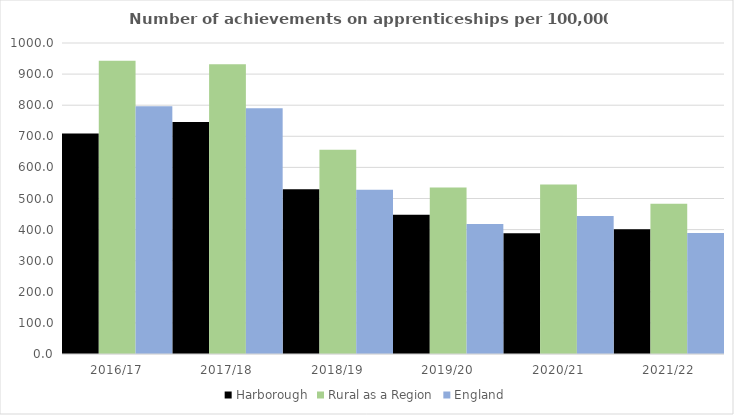
| Category | Harborough | Rural as a Region | England |
|---|---|---|---|
| 2016/17 | 709 | 942.594 | 797 |
| 2017/18 | 746 | 931.709 | 790 |
| 2018/19 | 530 | 656.44 | 528 |
| 2019/20 | 448 | 535.552 | 418 |
| 2020/21 | 388 | 545.333 | 444 |
| 2021/22 | 401 | 482.936 | 389 |